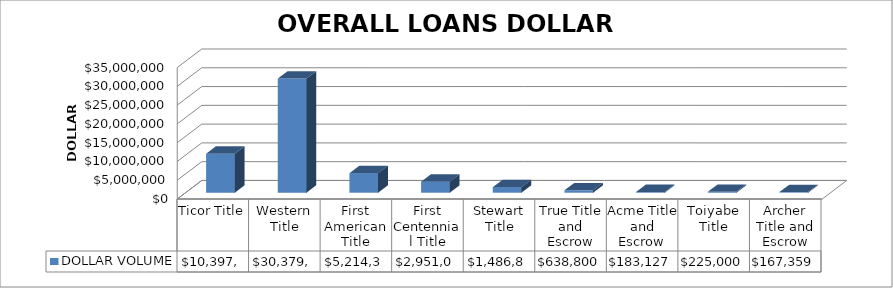
| Category | DOLLAR VOLUME |
|---|---|
| Ticor Title | 10397619 |
| Western Title | 30379255 |
| First American Title | 5214364 |
| First Centennial Title | 2951060 |
| Stewart Title | 1486884 |
| True Title and Escrow | 638800 |
| Acme Title and Escrow | 183127 |
| Toiyabe Title | 225000 |
| Archer Title and Escrow | 167359 |